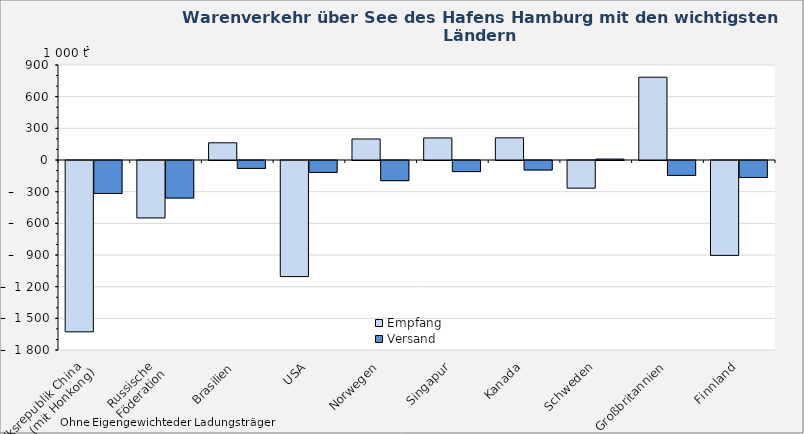
| Category | Empfang | Versand |
|---|---|---|
| Volksrepublik China 
(mit Honkong) | -1623 | -312 |
| Russische 
Föderation | -544 | -356 |
| Brasilien | 163 | -75 |
| USA | -1100 | -113 |
| Norwegen | 199 | -191 |
| Singapur | 209 | -105 |
| Kanada | 210 | -90 |
| Schweden | -262 | 9 |
| Großbritannien | 784 | -141 |
| Finnland | -899 | -161 |